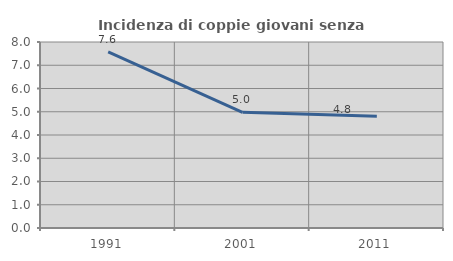
| Category | Incidenza di coppie giovani senza figli |
|---|---|
| 1991.0 | 7.576 |
| 2001.0 | 4.976 |
| 2011.0 | 4.805 |